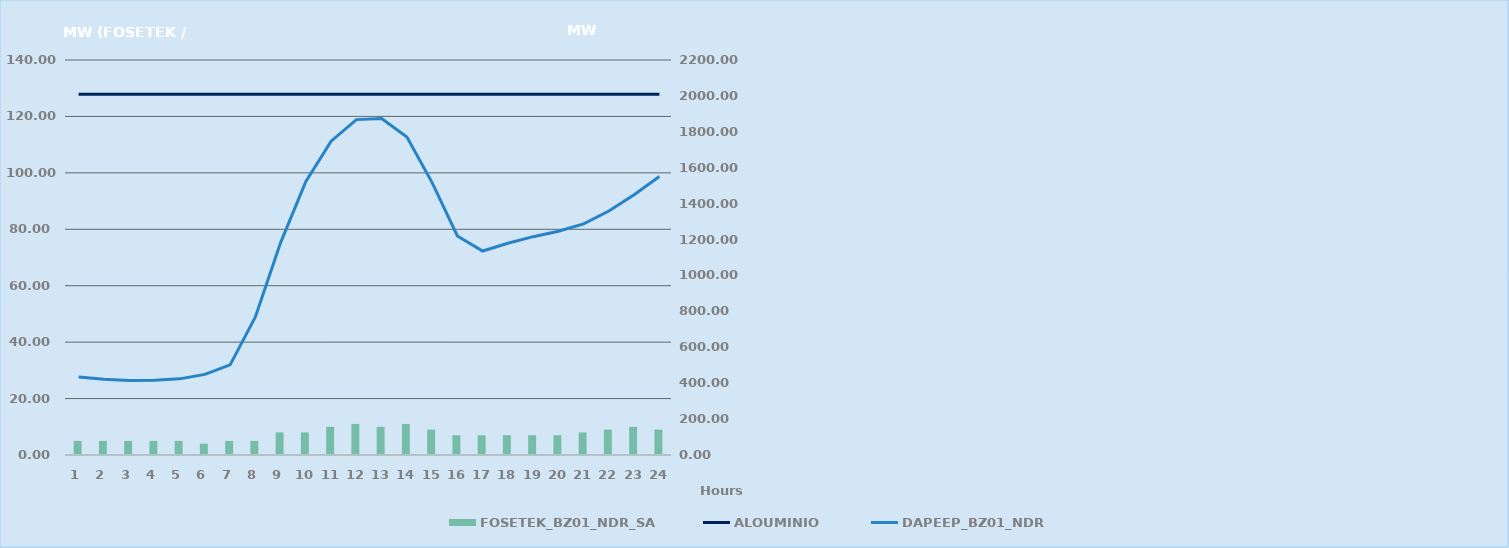
| Category | FOSETEK_BZ01_NDR_SA |
|---|---|
| 0 | 5 |
| 1 | 5 |
| 2 | 5 |
| 3 | 5 |
| 4 | 5 |
| 5 | 4 |
| 6 | 5 |
| 7 | 5 |
| 8 | 8 |
| 9 | 8 |
| 10 | 10 |
| 11 | 11 |
| 12 | 10 |
| 13 | 11 |
| 14 | 9 |
| 15 | 7 |
| 16 | 7 |
| 17 | 7 |
| 18 | 7 |
| 19 | 7 |
| 20 | 8 |
| 21 | 9 |
| 22 | 10 |
| 23 | 9 |